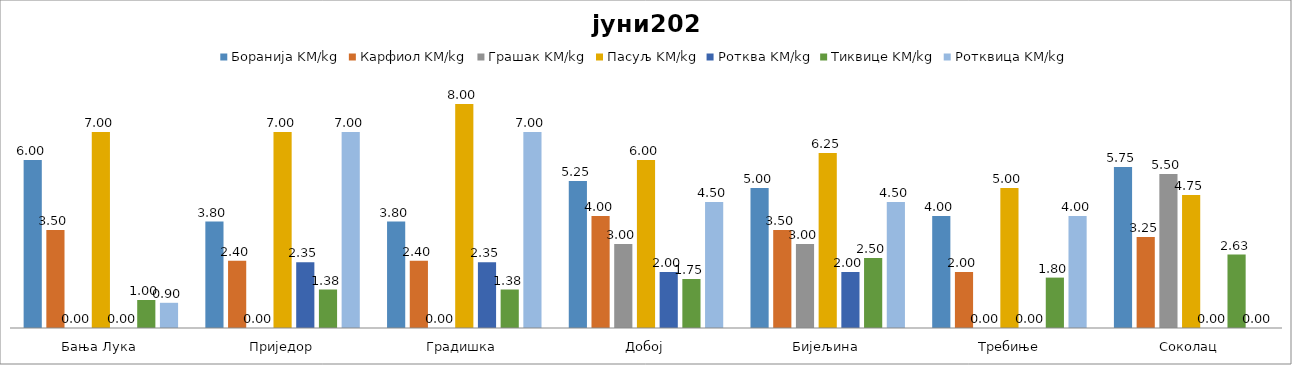
| Category | Боранија KM/kg | Карфиол KM/kg | Грашак KM/kg | Пасуљ KM/kg | Ротква KM/kg | Тиквице KM/kg | Ротквица KM/kg |
|---|---|---|---|---|---|---|---|
| Бања Лука | 6 | 3.5 | 0 | 7 | 0 | 1 | 0.9 |
| Приједор | 3.8 | 2.4 | 0 | 7 | 2.35 | 1.375 | 7 |
| Градишка | 3.8 | 2.4 | 0 | 8 | 2.35 | 1.375 | 7 |
| Добој | 5.25 | 4 | 3 | 6 | 2 | 1.75 | 4.5 |
| Бијељина | 5 | 3.5 | 3 | 6.25 | 2 | 2.5 | 4.5 |
|  Требиње | 4 | 2 | 0 | 5 | 0 | 1.8 | 4 |
| Соколац | 5.75 | 3.25 | 5.5 | 4.75 | 0 | 2.625 | 0 |